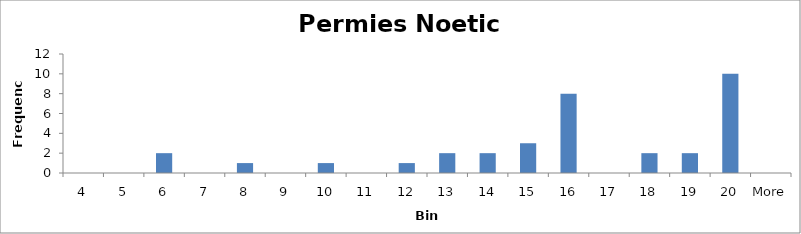
| Category | Frequency |
|---|---|
| 4 | 0 |
| 5 | 0 |
| 6 | 2 |
| 7 | 0 |
| 8 | 1 |
| 9 | 0 |
| 10 | 1 |
| 11 | 0 |
| 12 | 1 |
| 13 | 2 |
| 14 | 2 |
| 15 | 3 |
| 16 | 8 |
| 17 | 0 |
| 18 | 2 |
| 19 | 2 |
| 20 | 10 |
| More | 0 |